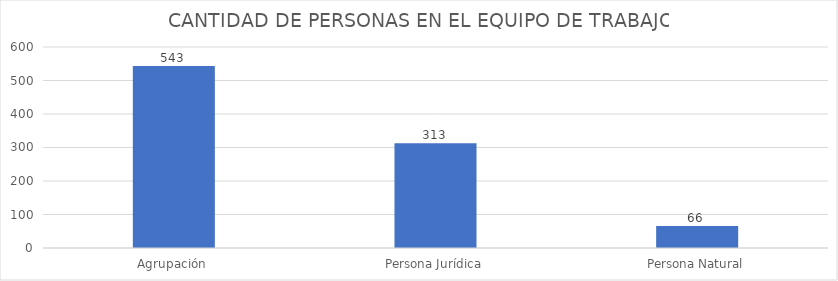
| Category | CANTIDAD DE PERSONAS EN EL EQUIPO DE TRABAJO |
|---|---|
| Agrupación | 543 |
| Persona Jurídica | 313 |
| Persona Natural | 66 |